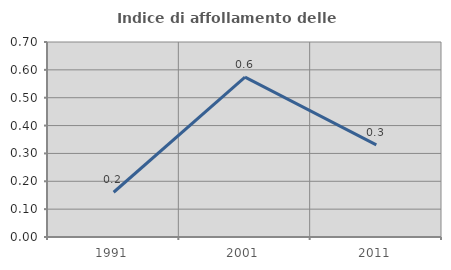
| Category | Indice di affollamento delle abitazioni  |
|---|---|
| 1991.0 | 0.161 |
| 2001.0 | 0.574 |
| 2011.0 | 0.33 |